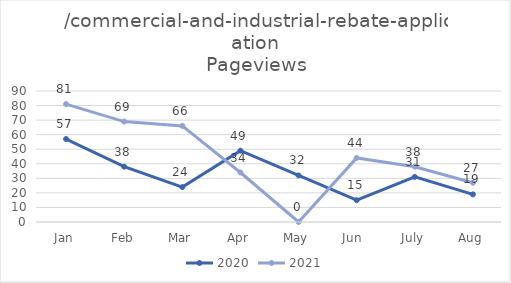
| Category | 2020 | 2021 |
|---|---|---|
| Jan | 57 | 81 |
| Feb | 38 | 69 |
| Mar | 24 | 66 |
| Apr | 49 | 34 |
| May | 32 | 0 |
| Jun  | 15 | 44 |
| July | 31 | 38 |
| Aug | 19 | 27 |